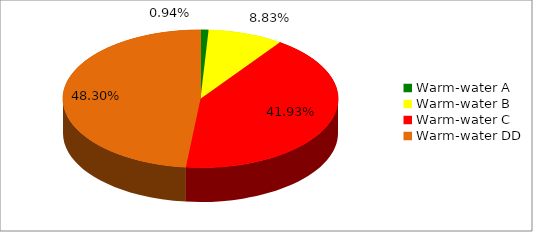
| Category | Series 0 |
|---|---|
| Warm-water A | 0.009 |
| Warm-water B | 0.088 |
| Warm-water C | 0.419 |
| Warm-water DD | 0.483 |